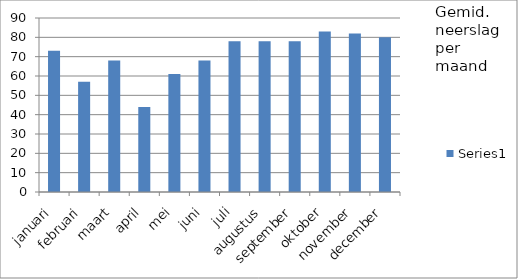
| Category | Series 0 |
|---|---|
| januari | 73 |
| februari | 57 |
| maart | 68 |
| april | 44 |
| mei | 61 |
| juni | 68 |
| juli | 78 |
| augustus | 78 |
| september | 78 |
| oktober | 83 |
| november | 82 |
| december | 80 |